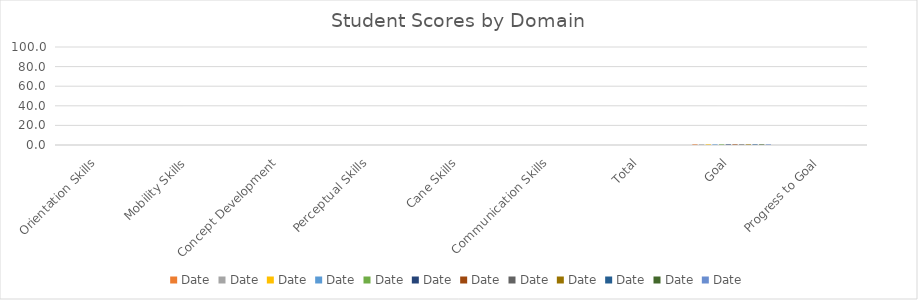
| Category | Date |
|---|---|
| Orientation Skills | 0 |
| Mobility Skills | 0 |
| Concept Development | 0 |
| Perceptual Skills | 0 |
| Cane Skills | 0 |
| Communication Skills | 0 |
| Total | 0 |
| Goal | 1 |
| Progress to Goal | 0 |